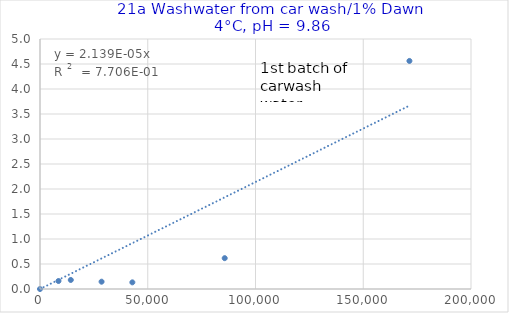
| Category | Series 0 |
|---|---|
| 0.0 | 0 |
| 8571.428571428572 | 0.16 |
| 14285.714285714286 | 0.181 |
| 28571.428571428572 | 0.146 |
| 42857.14285714286 | 0.133 |
| 85714.28571428572 | 0.617 |
| 171428.57142857145 | 4.561 |